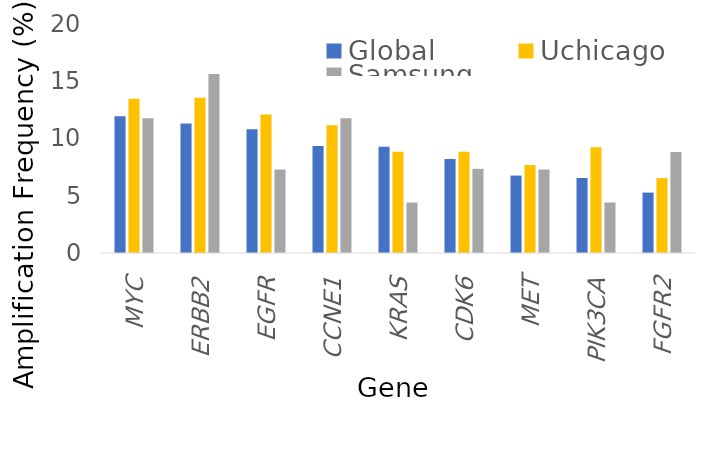
| Category | Global | Uchicago | Samsung |
|---|---|---|---|
| MYC | 11.952 | 13.462 | 11.765 |
| ERBB2 | 11.309 | 13.553 | 15.625 |
| EGFR | 10.817 | 12.088 | 7.292 |
| CCNE1 | 9.345 | 11.154 | 11.765 |
| KRAS | 9.282 | 8.846 | 4.412 |
| CDK6 | 8.201 | 8.846 | 7.353 |
| MET | 6.761 | 7.692 | 7.292 |
| PIK3CA | 6.548 | 9.231 | 4.412 |
| FGFR2 | 5.277 | 6.538 | 8.824 |